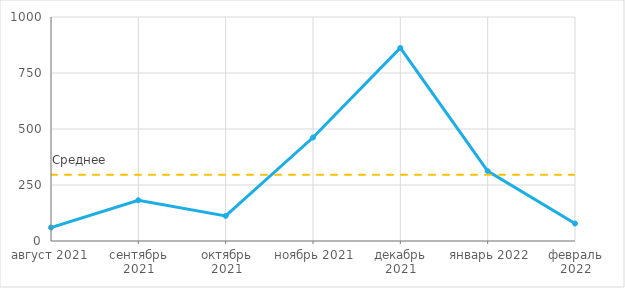
| Category | Price (Сумма) | Среднее |
|---|---|---|
| 2021-08-02 | 60 | 295.429 |
| 2021-09-01 | 182 | 295.429 |
| 2021-10-01 | 112 | 295.429 |
| 2021-11-01 | 462 | 295.429 |
| 2021-12-01 | 862 | 295.429 |
| 2022-01-01 | 312 | 295.429 |
| 2022-02-01 | 78 | 295.429 |